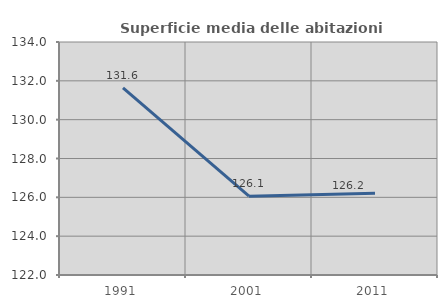
| Category | Superficie media delle abitazioni occupate |
|---|---|
| 1991.0 | 131.635 |
| 2001.0 | 126.06 |
| 2011.0 | 126.212 |